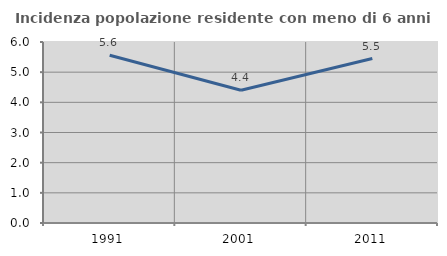
| Category | Incidenza popolazione residente con meno di 6 anni |
|---|---|
| 1991.0 | 5.56 |
| 2001.0 | 4.401 |
| 2011.0 | 5.452 |